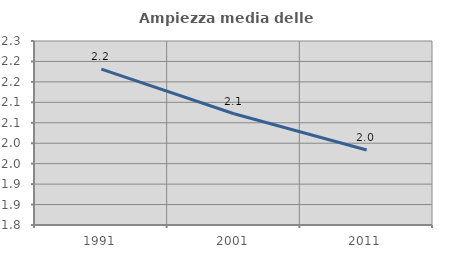
| Category | Ampiezza media delle famiglie |
|---|---|
| 1991.0 | 2.181 |
| 2001.0 | 2.072 |
| 2011.0 | 1.983 |